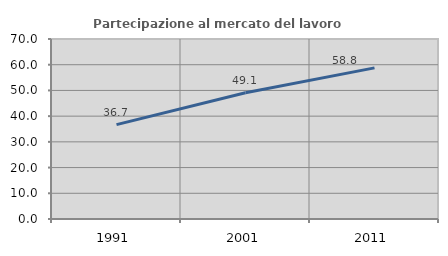
| Category | Partecipazione al mercato del lavoro  femminile |
|---|---|
| 1991.0 | 36.687 |
| 2001.0 | 49.099 |
| 2011.0 | 58.769 |